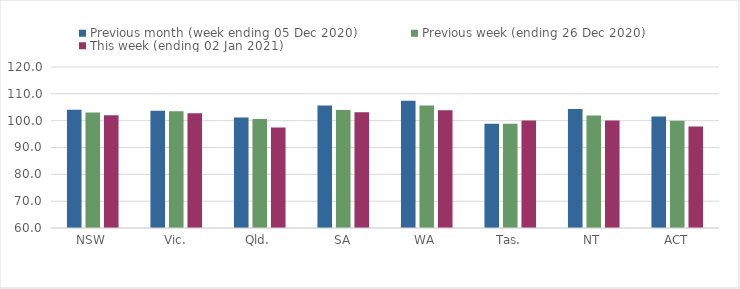
| Category | Previous month (week ending 05 Dec 2020) | Previous week (ending 26 Dec 2020) | This week (ending 02 Jan 2021) |
|---|---|---|---|
| NSW | 104.04 | 103.08 | 102.05 |
| Vic. | 103.68 | 103.48 | 102.73 |
| Qld. | 101.14 | 100.65 | 97.43 |
| SA | 105.66 | 103.97 | 103.17 |
| WA | 107.38 | 105.61 | 103.87 |
| Tas. | 98.88 | 98.84 | 100.09 |
| NT | 104.32 | 101.94 | 100.02 |
| ACT | 101.54 | 99.95 | 97.81 |